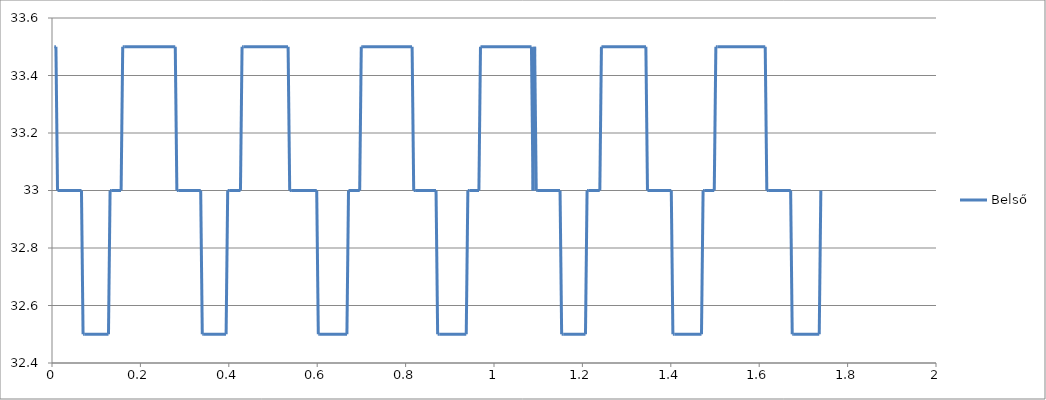
| Category | Belső |
|---|---|
| 0.005277777777777715 | 33.5 |
| 0.008888888888885838 | 33.5 |
| 0.01249999999999929 | 33 |
| 0.016111111111107412 | 33 |
| 0.019722222222220864 | 33 |
| 0.023333333333334316 | 33 |
| 0.02694444444444244 | 33 |
| 0.03055555555555589 | 33 |
| 0.034166666666664014 | 33 |
| 0.037777777777777466 | 33 |
| 0.04138888888888559 | 33 |
| 0.04499999999999904 | 33 |
| 0.04861111111110983 | 33 |
| 0.052222222222220616 | 33 |
| 0.0558333333333314 | 33 |
| 0.05944444444444219 | 33 |
| 0.06305555555555298 | 33 |
| 0.06666666666666643 | 33 |
| 0.07027777777777455 | 32.5 |
| 0.07361111111110841 | 32.5 |
| 0.07722222222222186 | 32.5 |
| 0.08083333333332998 | 32.5 |
| 0.08444444444444343 | 32.5 |
| 0.08805555555555156 | 32.5 |
| 0.09166666666666501 | 32.5 |
| 0.09527777777777846 | 32.5 |
| 0.09888888888888658 | 32.5 |
| 0.10250000000000004 | 32.5 |
| 0.10611111111110816 | 32.5 |
| 0.10972222222222161 | 32.5 |
| 0.1133333333333324 | 32.5 |
| 0.11694444444444319 | 32.5 |
| 0.12055555555555397 | 32.5 |
| 0.12416666666666476 | 32.5 |
| 0.12777777777777555 | 32.5 |
| 0.13138888888888633 | 33 |
| 0.13499999999999712 | 33 |
| 0.13861111111111057 | 33 |
| 0.1422222222222187 | 33 |
| 0.14555555555555255 | 33 |
| 0.149166666666666 | 33 |
| 0.15277777777777413 | 33 |
| 0.15638888888888758 | 33 |
| 0.1599999999999957 | 33.5 |
| 0.16361111111110915 | 33.5 |
| 0.1672222222222226 | 33.5 |
| 0.17083333333333073 | 33.5 |
| 0.17444444444444418 | 33.5 |
| 0.1780555555555523 | 33.5 |
| 0.18166666666666575 | 33.5 |
| 0.18527777777777654 | 33.5 |
| 0.18888888888888733 | 33.5 |
| 0.19249999999999812 | 33.5 |
| 0.1961111111111089 | 33.5 |
| 0.1997222222222197 | 33.5 |
| 0.20333333333333314 | 33.5 |
| 0.20694444444444127 | 33.5 |
| 0.21055555555555472 | 33.5 |
| 0.21388888888888857 | 33.5 |
| 0.2174999999999967 | 33.5 |
| 0.22111111111111015 | 33.5 |
| 0.22472222222221827 | 33.5 |
| 0.22833333333333172 | 33.5 |
| 0.23194444444444517 | 33.5 |
| 0.2355555555555533 | 33.5 |
| 0.23916666666666675 | 33.5 |
| 0.24277777777777487 | 33.5 |
| 0.24638888888888832 | 33.5 |
| 0.2499999999999991 | 33.5 |
| 0.2536111111111099 | 33.5 |
| 0.2572222222222207 | 33.5 |
| 0.2608333333333315 | 33.5 |
| 0.26444444444444226 | 33.5 |
| 0.2680555555555557 | 33.5 |
| 0.27166666666666384 | 33.5 |
| 0.2752777777777773 | 33.5 |
| 0.2788888888888854 | 33.5 |
| 0.28249999999999886 | 33 |
| 0.286111111111107 | 33 |
| 0.28944444444444084 | 33 |
| 0.2930555555555543 | 33 |
| 0.2966666666666624 | 33 |
| 0.30027777777777587 | 33 |
| 0.3038888888888893 | 33 |
| 0.30749999999999744 | 33 |
| 0.3111111111111109 | 33 |
| 0.314722222222219 | 33 |
| 0.31833333333333247 | 33 |
| 0.32194444444444326 | 33 |
| 0.32555555555555404 | 33 |
| 0.32916666666666483 | 33 |
| 0.3327777777777756 | 33 |
| 0.3363888888888864 | 33 |
| 0.33999999999999986 | 32.5 |
| 0.343611111111108 | 32.5 |
| 0.34722222222222143 | 32.5 |
| 0.35083333333332956 | 32.5 |
| 0.354444444444443 | 32.5 |
| 0.35805555555555646 | 32.5 |
| 0.3616666666666646 | 32.5 |
| 0.36499999999999844 | 32.5 |
| 0.3686111111111119 | 32.5 |
| 0.37222222222222 | 32.5 |
| 0.37611111111110773 | 32.5 |
| 0.3794444444444416 | 32.5 |
| 0.38305555555555504 | 32.5 |
| 0.3866666666666658 | 32.5 |
| 0.3902777777777766 | 32.5 |
| 0.3938888888888874 | 32.5 |
| 0.3974999999999982 | 33 |
| 0.401111111111109 | 33 |
| 0.40472222222221976 | 33 |
| 0.40833333333333055 | 33 |
| 0.411944444444444 | 33 |
| 0.4155555555555521 | 33 |
| 0.4191666666666656 | 33 |
| 0.4227777777777737 | 33 |
| 0.42638888888888715 | 33 |
| 0.4300000000000006 | 33.5 |
| 0.4336111111111087 | 33.5 |
| 0.4372222222222222 | 33.5 |
| 0.4408333333333303 | 33.5 |
| 0.44416666666666416 | 33.5 |
| 0.44805555555555454 | 33.5 |
| 0.45138888888888573 | 33.5 |
| 0.4549999999999992 | 33.5 |
| 0.45861111111110997 | 33.5 |
| 0.46222222222222076 | 33.5 |
| 0.46583333333333155 | 33.5 |
| 0.46944444444444233 | 33.5 |
| 0.4730555555555531 | 33.5 |
| 0.47666666666666657 | 33.5 |
| 0.4802777777777747 | 33.5 |
| 0.48388888888888815 | 33.5 |
| 0.48749999999999627 | 33.5 |
| 0.4911111111111097 | 33.5 |
| 0.4947222222222232 | 33.5 |
| 0.4983333333333313 | 33.5 |
| 0.5019444444444447 | 33.5 |
| 0.5055555555555529 | 33.5 |
| 0.5091666666666663 | 33.5 |
| 0.5127777777777744 | 33.5 |
| 0.5163888888888879 | 33.5 |
| 0.5197222222222218 | 33.5 |
| 0.5233333333333325 | 33.5 |
| 0.5272222222222203 | 33.5 |
| 0.5305555555555541 | 33.5 |
| 0.5341666666666649 | 33.5 |
| 0.5377777777777757 | 33 |
| 0.5413888888888865 | 33 |
| 0.5449999999999973 | 33 |
| 0.5486111111111107 | 33 |
| 0.5522222222222188 | 33 |
| 0.5558333333333323 | 33 |
| 0.5594444444444404 | 33 |
| 0.5630555555555539 | 33 |
| 0.5666666666666673 | 33 |
| 0.5702777777777754 | 33 |
| 0.5738888888888889 | 33 |
| 0.577499999999997 | 33 |
| 0.5811111111111105 | 33 |
| 0.5847222222222213 | 33 |
| 0.5880555555555524 | 33 |
| 0.5916666666666659 | 33 |
| 0.5952777777777767 | 33 |
| 0.5988888888888875 | 33 |
| 0.6024999999999983 | 32.5 |
| 0.606111111111109 | 32.5 |
| 0.6097222222222198 | 32.5 |
| 0.6133333333333333 | 32.5 |
| 0.6169444444444414 | 32.5 |
| 0.6205555555555549 | 32.5 |
| 0.624166666666663 | 32.5 |
| 0.6277777777777764 | 32.5 |
| 0.6313888888888899 | 32.5 |
| 0.634999999999998 | 32.5 |
| 0.6386111111111115 | 32.5 |
| 0.6422222222222196 | 32.5 |
| 0.645833333333333 | 32.5 |
| 0.6494444444444412 | 32.5 |
| 0.6530555555555546 | 32.5 |
| 0.6566666666666654 | 32.5 |
| 0.6599999999999966 | 32.5 |
| 0.66361111111111 | 32.5 |
| 0.6672222222222208 | 32.5 |
| 0.6708333333333316 | 33 |
| 0.6744444444444424 | 33 |
| 0.6780555555555532 | 33 |
| 0.681666666666664 | 33 |
| 0.6852777777777774 | 33 |
| 0.6888888888888856 | 33 |
| 0.692499999999999 | 33 |
| 0.6961111111111071 | 33 |
| 0.6997222222222206 | 33.5 |
| 0.703333333333334 | 33.5 |
| 0.7069444444444422 | 33.5 |
| 0.7105555555555556 | 33.5 |
| 0.7141666666666637 | 33.5 |
| 0.7177777777777772 | 33.5 |
| 0.721388888888888 | 33.5 |
| 0.7249999999999988 | 33.5 |
| 0.7286111111111095 | 33.5 |
| 0.7322222222222203 | 33.5 |
| 0.7355555555555542 | 33.5 |
| 0.739166666666665 | 33.5 |
| 0.7427777777777758 | 33.5 |
| 0.7463888888888865 | 33.5 |
| 0.75 | 33.5 |
| 0.7536111111111081 | 33.5 |
| 0.7572222222222216 | 33.5 |
| 0.7608333333333297 | 33.5 |
| 0.7644444444444431 | 33.5 |
| 0.7680555555555566 | 33.5 |
| 0.7716666666666647 | 33.5 |
| 0.7752777777777782 | 33.5 |
| 0.7788888888888863 | 33.5 |
| 0.7824999999999998 | 33.5 |
| 0.7861111111111079 | 33.5 |
| 0.7897222222222213 | 33.5 |
| 0.7933333333333321 | 33.5 |
| 0.7969444444444429 | 33.5 |
| 0.8005555555555537 | 33.5 |
| 0.8041666666666645 | 33.5 |
| 0.8077777777777753 | 33.5 |
| 0.8111111111111091 | 33.5 |
| 0.8147222222222199 | 33.5 |
| 0.8183333333333307 | 33 |
| 0.8219444444444441 | 33 |
| 0.8255555555555523 | 33 |
| 0.8291666666666657 | 33 |
| 0.8327777777777738 | 33 |
| 0.8363888888888873 | 33 |
| 0.8400000000000007 | 33 |
| 0.8436111111111089 | 33 |
| 0.8472222222222223 | 33 |
| 0.8508333333333304 | 33 |
| 0.8544444444444439 | 33 |
| 0.8580555555555547 | 33 |
| 0.8616666666666655 | 33 |
| 0.8652777777777763 | 33 |
| 0.868888888888887 | 33 |
| 0.8724999999999978 | 32.5 |
| 0.8761111111111086 | 32.5 |
| 0.8797222222222194 | 32.5 |
| 0.8830555555555533 | 32.5 |
| 0.8866666666666667 | 32.5 |
| 0.8902777777777748 | 32.5 |
| 0.8938888888888883 | 32.5 |
| 0.8974999999999964 | 32.5 |
| 0.9011111111111099 | 32.5 |
| 0.904722222222218 | 32.5 |
| 0.9083333333333314 | 32.5 |
| 0.9119444444444449 | 32.5 |
| 0.915555555555553 | 32.5 |
| 0.9191666666666665 | 32.5 |
| 0.9227777777777746 | 32.5 |
| 0.926388888888888 | 32.5 |
| 0.9299999999999988 | 32.5 |
| 0.9336111111111096 | 32.5 |
| 0.9372222222222204 | 32.5 |
| 0.9408333333333312 | 33 |
| 0.944444444444442 | 33 |
| 0.9480555555555554 | 33 |
| 0.9516666666666636 | 33 |
| 0.955277777777777 | 33 |
| 0.9586111111111109 | 33 |
| 0.962222222222219 | 33 |
| 0.9658333333333324 | 33 |
| 0.9694444444444406 | 33.5 |
| 0.973055555555554 | 33.5 |
| 0.9766666666666675 | 33.5 |
| 0.9802777777777756 | 33.5 |
| 0.983888888888889 | 33.5 |
| 0.9874999999999972 | 33.5 |
| 0.9911111111111106 | 33.5 |
| 0.9947222222222214 | 33.5 |
| 0.9983333333333322 | 33.5 |
| 1.001944444444443 | 33.5 |
| 1.0055555555555538 | 33.5 |
| 1.0091666666666645 | 33.5 |
| 1.012777777777778 | 33.5 |
| 1.0163888888888861 | 33.5 |
| 1.0199999999999996 | 33.5 |
| 1.0236111111111077 | 33.5 |
| 1.0272222222222211 | 33.5 |
| 1.0308333333333293 | 33.5 |
| 1.0341666666666631 | 33.5 |
| 1.0377777777777766 | 33.5 |
| 1.0413888888888847 | 33.5 |
| 1.0449999999999982 | 33.5 |
| 1.0486111111111116 | 33.5 |
| 1.0522222222222197 | 33.5 |
| 1.0558333333333332 | 33.5 |
| 1.0594444444444413 | 33.5 |
| 1.0630555555555548 | 33.5 |
| 1.0666666666666655 | 33.5 |
| 1.0702777777777763 | 33.5 |
| 1.0738888888888871 | 33.5 |
| 1.077499999999998 | 33.5 |
| 1.0811111111111087 | 33.5 |
| 1.0847222222222221 | 33.5 |
| 1.0883333333333303 | 33 |
| 1.0919444444444437 | 33.5 |
| 1.0955555555555518 | 33 |
| 1.0991666666666653 | 33 |
| 1.1024999999999991 | 33 |
| 1.1061111111111073 | 33 |
| 1.1097222222222207 | 33 |
| 1.1133333333333342 | 33 |
| 1.1169444444444423 | 33 |
| 1.1205555555555557 | 33 |
| 1.1241666666666639 | 33 |
| 1.1277777777777773 | 33 |
| 1.1313888888888854 | 33 |
| 1.134999999999999 | 33 |
| 1.1386111111111097 | 33 |
| 1.1422222222222205 | 33 |
| 1.1458333333333313 | 33 |
| 1.149444444444442 | 33 |
| 1.1530555555555528 | 32.5 |
| 1.1566666666666663 | 32.5 |
| 1.1602777777777744 | 32.5 |
| 1.1638888888888879 | 32.5 |
| 1.167499999999996 | 32.5 |
| 1.1711111111111094 | 32.5 |
| 1.1744444444444433 | 32.5 |
| 1.1780555555555514 | 32.5 |
| 1.1816666666666649 | 32.5 |
| 1.1852777777777783 | 32.5 |
| 1.1888888888888864 | 32.5 |
| 1.1925 | 32.5 |
| 1.196111111111108 | 32.5 |
| 1.1997222222222215 | 32.5 |
| 1.2033333333333323 | 32.5 |
| 1.206944444444443 | 32.5 |
| 1.2105555555555538 | 33 |
| 1.2141666666666646 | 33 |
| 1.2177777777777754 | 33 |
| 1.2213888888888889 | 33 |
| 1.224999999999997 | 33 |
| 1.2286111111111104 | 33 |
| 1.2322222222222186 | 33 |
| 1.235833333333332 | 33 |
| 1.2394444444444455 | 33 |
| 1.2430555555555536 | 33.5 |
| 1.246666666666667 | 33.5 |
| 1.2500000000000009 | 33.5 |
| 1.2538888888888886 | 33.5 |
| 1.2572222222222225 | 33.5 |
| 1.2608333333333306 | 33.5 |
| 1.264444444444444 | 33.5 |
| 1.2680555555555548 | 33.5 |
| 1.2716666666666656 | 33.5 |
| 1.2752777777777764 | 33.5 |
| 1.2788888888888872 | 33.5 |
| 1.282499999999998 | 33.5 |
| 1.2861111111111088 | 33.5 |
| 1.2897222222222195 | 33.5 |
| 1.293333333333333 | 33.5 |
| 1.2969444444444411 | 33.5 |
| 1.3005555555555546 | 33.5 |
| 1.3041666666666627 | 33.5 |
| 1.3077777777777762 | 33.5 |
| 1.3113888888888896 | 33.5 |
| 1.3149999999999977 | 33.5 |
| 1.3186111111111112 | 33.5 |
| 1.3222222222222193 | 33.5 |
| 1.3258333333333328 | 33.5 |
| 1.3291666666666666 | 33.5 |
| 1.3327777777777747 | 33.5 |
| 1.3363888888888882 | 33.5 |
| 1.339999999999999 | 33.5 |
| 1.3436111111111098 | 33.5 |
| 1.3472222222222205 | 33 |
| 1.3508333333333313 | 33 |
| 1.3544444444444421 | 33 |
| 1.3580555555555556 | 33 |
| 1.3616666666666637 | 33 |
| 1.3652777777777771 | 33 |
| 1.3688888888888853 | 33 |
| 1.3724999999999987 | 33 |
| 1.3761111111111068 | 33 |
| 1.3797222222222203 | 33 |
| 1.3833333333333337 | 33 |
| 1.3869444444444419 | 33 |
| 1.3905555555555553 | 33 |
| 1.3941666666666634 | 33 |
| 1.3974999999999973 | 33 |
| 1.4011111111111108 | 33 |
| 1.4047222222222189 | 32.5 |
| 1.4083333333333323 | 32.5 |
| 1.4119444444444431 | 32.5 |
| 1.415555555555554 | 32.5 |
| 1.4191666666666647 | 32.5 |
| 1.4227777777777755 | 32.5 |
| 1.4263888888888863 | 32.5 |
| 1.4299999999999997 | 32.5 |
| 1.4336111111111078 | 32.5 |
| 1.4372222222222213 | 32.5 |
| 1.4408333333333294 | 32.5 |
| 1.4444444444444429 | 32.5 |
| 1.4480555555555563 | 32.5 |
| 1.4516666666666644 | 32.5 |
| 1.455277777777778 | 32.5 |
| 1.458888888888886 | 32.5 |
| 1.4624999999999995 | 32.5 |
| 1.4661111111111103 | 32.5 |
| 1.4694444444444414 | 32.5 |
| 1.473055555555555 | 33 |
| 1.4766666666666657 | 33 |
| 1.4802777777777765 | 33 |
| 1.4838888888888873 | 33 |
| 1.487499999999998 | 33 |
| 1.4911111111111088 | 33 |
| 1.4947222222222223 | 33 |
| 1.4983333333333304 | 33 |
| 1.5019444444444439 | 33.5 |
| 1.505555555555552 | 33.5 |
| 1.5091666666666654 | 33.5 |
| 1.5127777777777736 | 33.5 |
| 1.516388888888887 | 33.5 |
| 1.5200000000000005 | 33.5 |
| 1.5236111111111086 | 33.5 |
| 1.527222222222222 | 33.5 |
| 1.5308333333333302 | 33.5 |
| 1.5344444444444436 | 33.5 |
| 1.5380555555555544 | 33.5 |
| 1.5416666666666652 | 33.5 |
| 1.545277777777776 | 33.5 |
| 1.5486111111111098 | 33.5 |
| 1.5522222222222206 | 33.5 |
| 1.5558333333333314 | 33.5 |
| 1.5594444444444422 | 33.5 |
| 1.563055555555553 | 33.5 |
| 1.5666666666666664 | 33.5 |
| 1.5702777777777746 | 33.5 |
| 1.573888888888888 | 33.5 |
| 1.5774999999999961 | 33.5 |
| 1.5811111111111096 | 33.5 |
| 1.584722222222223 | 33.5 |
| 1.5883333333333312 | 33.5 |
| 1.5919444444444446 | 33.5 |
| 1.5955555555555527 | 33.5 |
| 1.5991666666666662 | 33.5 |
| 1.602777777777777 | 33.5 |
| 1.6063888888888878 | 33.5 |
| 1.6099999999999985 | 33.5 |
| 1.6136111111111093 | 33.5 |
| 1.6172222222222201 | 33 |
| 1.620555555555554 | 33 |
| 1.6244444444444417 | 33 |
| 1.6277777777777755 | 33 |
| 1.631388888888889 | 33 |
| 1.6349999999999971 | 33 |
| 1.6386111111111106 | 33 |
| 1.6422222222222187 | 33 |
| 1.6458333333333321 | 33 |
| 1.6494444444444403 | 33 |
| 1.6530555555555537 | 33 |
| 1.6566666666666672 | 33 |
| 1.6602777777777753 | 33 |
| 1.6638888888888888 | 33 |
| 1.6674999999999969 | 33 |
| 1.6711111111111103 | 33 |
| 1.6747222222222211 | 32.5 |
| 1.678333333333332 | 32.5 |
| 1.6819444444444427 | 32.5 |
| 1.6855555555555535 | 32.5 |
| 1.6891666666666643 | 32.5 |
| 1.6924999999999981 | 32.5 |
| 1.696111111111109 | 32.5 |
| 1.6997222222222197 | 32.5 |
| 1.7033333333333331 | 32.5 |
| 1.7069444444444413 | 32.5 |
| 1.7105555555555547 | 32.5 |
| 1.7141666666666628 | 32.5 |
| 1.7177777777777763 | 32.5 |
| 1.7213888888888897 | 32.5 |
| 1.7249999999999979 | 32.5 |
| 1.7286111111111113 | 32.5 |
| 1.7322222222222194 | 32.5 |
| 1.735833333333333 | 32.5 |
| 1.7394444444444437 | 33 |